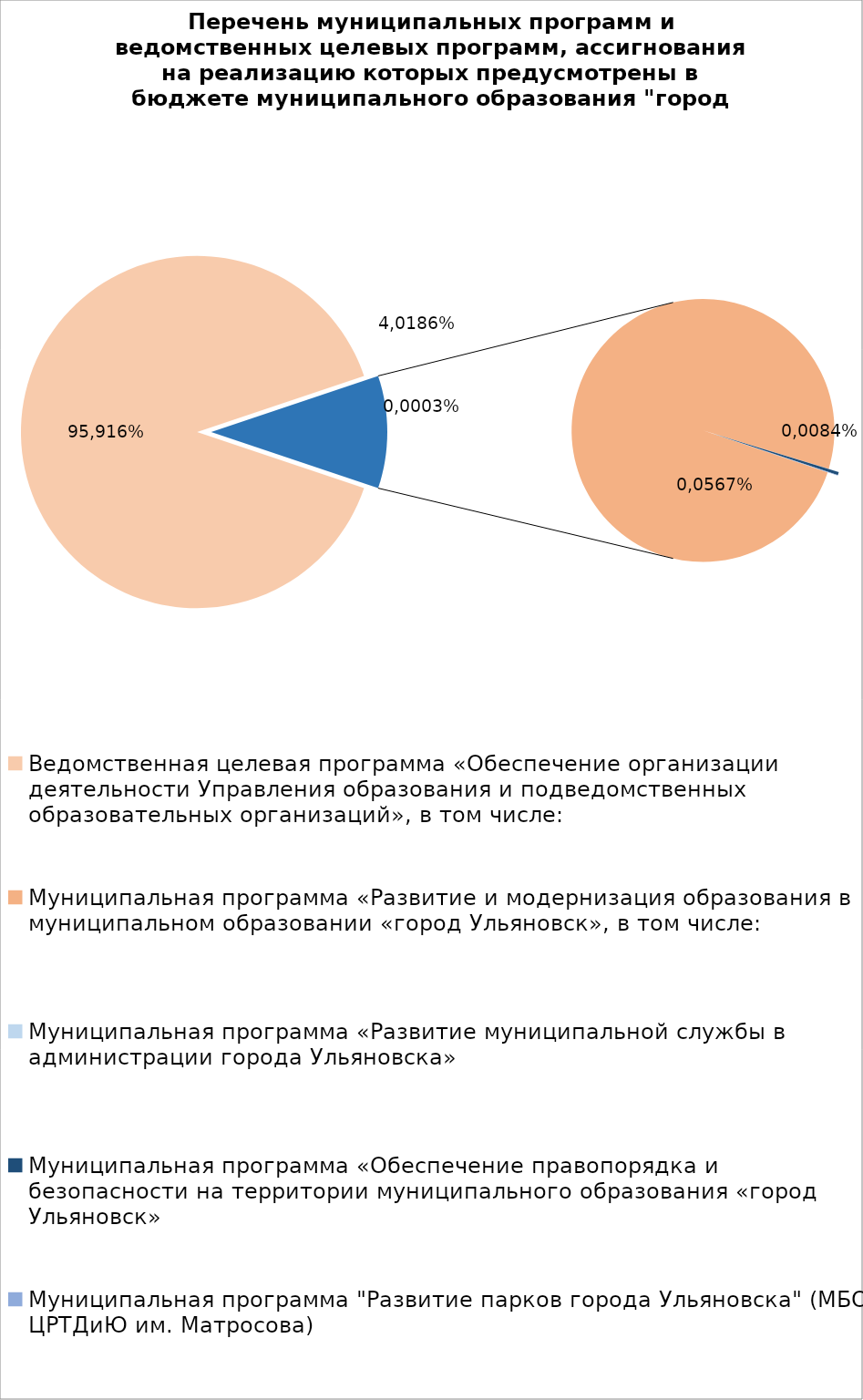
| Category | Series 0 |
|---|---|
| Ведомственная целевая программа «Обеспечение организации деятельности Управления образования и подведомственных образовательных организаций», в том числе: | 6185243.54 |
| Муниципальная программа «Развитие и модернизация образования в муниципальном образовании «город Ульяновск», в том числе: | 708797.45 |
| Муниципальная программа «Развитие муниципальной службы в администрации города Ульяновска» | 14.3 |
| Муниципальная программа «Обеспечение правопорядка и безопасности на территории муниципального образования «город Ульяновск» | 2700 |
| Муниципальная программа "Развитие парков города Ульяновска" (МБОУ ЦРТДиЮ им. Матросова) | 400 |